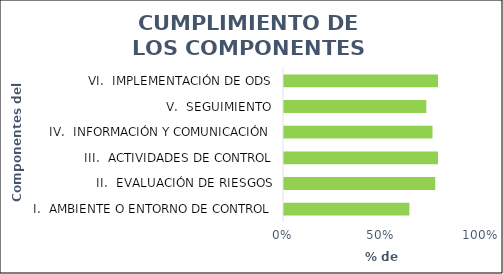
| Category | % |
|---|---|
| I.  AMBIENTE O ENTORNO DE CONTROL | 0.633 |
| II.  EVALUACIÓN DE RIESGOS | 0.764 |
| III.  ACTIVIDADES DE CONTROL | 0.778 |
| IV.  INFORMACIÓN Y COMUNICACIÓN | 0.75 |
| V.  SEGUIMIENTO | 0.719 |
| VI.  IMPLEMENTACIÓN DE ODS | 0.778 |